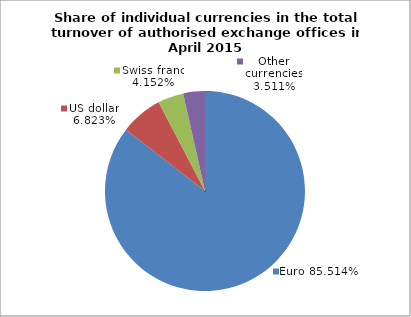
| Category | EUR |
|---|---|
| 0 | 0.855 |
| 1 | 0.068 |
| 2 | 0.042 |
| 3 | 0.035 |